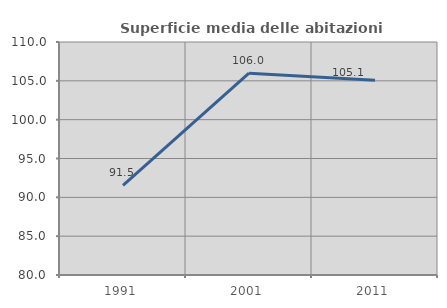
| Category | Superficie media delle abitazioni occupate |
|---|---|
| 1991.0 | 91.529 |
| 2001.0 | 105.989 |
| 2011.0 | 105.074 |